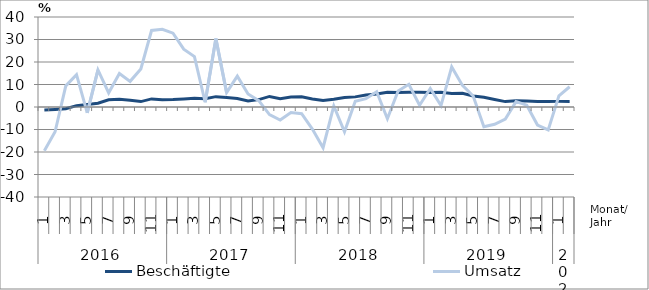
| Category | Beschäftigte | Umsatz |
|---|---|---|
| 0 | -1.3 | -19.4 |
| 1 | -1.1 | -11 |
| 2 | -0.8 | 9.4 |
| 3 | 0.6 | 14.4 |
| 4 | 1.1 | -2.6 |
| 5 | 1.7 | 16.5 |
| 6 | 3.2 | 6.3 |
| 7 | 3.4 | 14.9 |
| 8 | 3 | 11.4 |
| 9 | 2.4 | 16.9 |
| 10 | 3.6 | 34 |
| 11 | 3.2 | 34.5 |
| 12 | 3.3 | 32.8 |
| 13 | 3.6 | 25.7 |
| 14 | 3.9 | 22.4 |
| 15 | 3.7 | 2.1 |
| 16 | 4.6 | 30.4 |
| 17 | 4.2 | 6.4 |
| 18 | 3.8 | 13.7 |
| 19 | 2.7 | 5.8 |
| 20 | 3.3 | 2.8 |
| 21 | 4.7 | -3.4 |
| 22 | 3.7 | -5.8 |
| 23 | 4.4 | -2.5 |
| 24 | 4.5 | -3 |
| 25 | 3.6 | -9.8 |
| 26 | 2.9 | -18.1 |
| 27 | 3.4 | 0.5 |
| 28 | 4.2 | -11 |
| 29 | 4.5 | 2.5 |
| 30 | 5.3 | 3.7 |
| 31 | 5.8 | 6.8 |
| 32 | 6.6 | -5.2 |
| 33 | 6.5 | 7.1 |
| 34 | 6.6 | 10.1 |
| 35 | 6.6 | 0.8 |
| 36 | 6.4 | 8.2 |
| 37 | 6.5 | 0.6 |
| 38 | 6 | 17.8 |
| 39 | 6.1 | 9.6 |
| 40 | 4.9 | 4.9 |
| 41 | 4.3 | -8.8 |
| 42 | 3.3 | -7.7 |
| 43 | 2.4 | -5.4 |
| 44 | 2.8 | 2.4 |
| 45 | 2.7 | 0.8 |
| 46 | 2.4 | -8 |
| 47 | 2.4 | -10.2 |
| 48 | 2.5 | 5 |
| 49 | 2.5 | 9 |